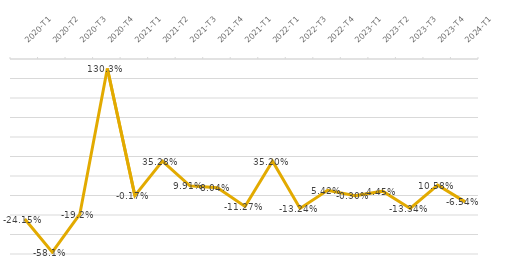
| Category | Series 0 |
|---|---|
| 2020-T1 | -0.242 |
| 2020-T2 | -0.581 |
| 2020-T3 | -0.192 |
| 2020-T4 | 1.303 |
| 2021-T1 | -0.002 |
| 2021-T2 | 0.353 |
| 2021-T3 | 0.099 |
| 2021-T4 | 0.08 |
| 2021-T1 | -0.113 |
| 2022-T1 | 0.352 |
| 2022-T3 | -0.132 |
| 2022-T4 | 0.054 |
| 2023-T1 | -0.003 |
| 2023-T2 | 0.044 |
| 2023-T3 | -0.133 |
| 2023-T4 | 0.106 |
| 2024-T1 | -0.065 |